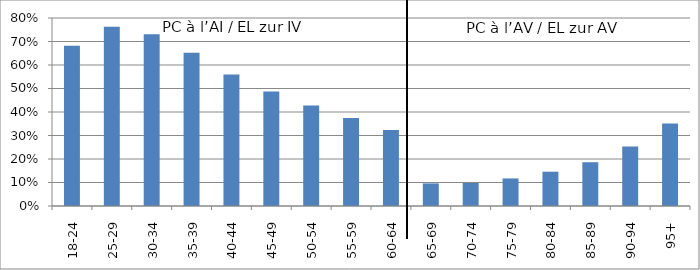
| Category | PC à l’AI / EL zur IV PC à l’AV / EL zur AV |
|---|---|
| 18-24 | 0.682 |
| 25-29 | 0.763 |
| 30-34 | 0.731 |
| 35-39 | 0.652 |
| 40-44 | 0.559 |
| 45-49 | 0.487 |
| 50-54 | 0.428 |
| 55-59 | 0.375 |
| 60-64 | 0.323 |
| 65-69 | 0.096 |
| 70-74 | 0.098 |
| 75-79 | 0.117 |
| 80-84 | 0.146 |
| 85-89 | 0.186 |
| 90-94 | 0.253 |
| 95+ | 0.351 |